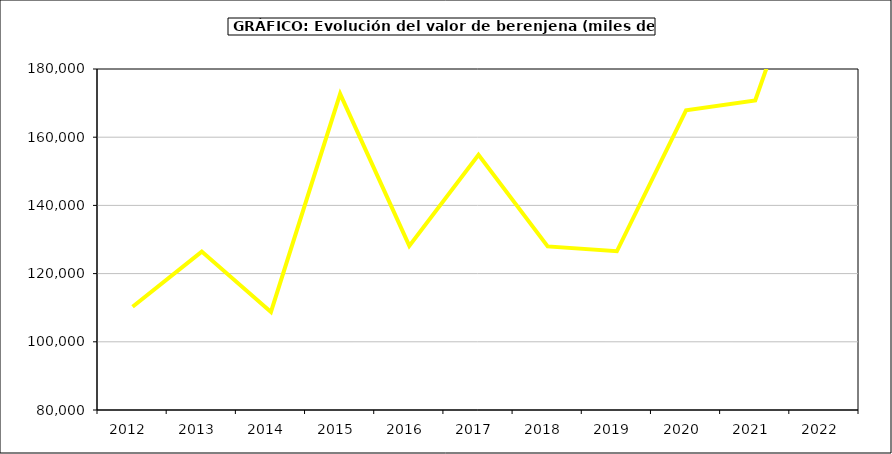
| Category | Valor |
|---|---|
| 2012.0 | 110271.616 |
| 2013.0 | 126461.496 |
| 2014.0 | 108753.977 |
| 2015.0 | 172694 |
| 2016.0 | 128140 |
| 2017.0 | 154840.085 |
| 2018.0 | 127980.525 |
| 2019.0 | 126544.365 |
| 2020.0 | 167880.78 |
| 2021.0 | 170769.748 |
| 2022.0 | 228713.375 |